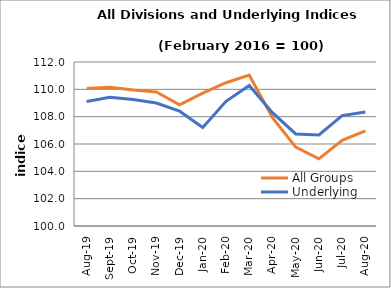
| Category | All Groups | Underlying |
|---|---|---|
| 2019-08-01 | 110.057 | 109.11 |
| 2019-09-01 | 110.148 | 109.423 |
| 2019-10-01 | 109.943 | 109.256 |
| 2019-11-01 | 109.811 | 108.998 |
| 2019-12-01 | 108.864 | 108.4 |
| 2020-01-01 | 109.718 | 107.211 |
| 2020-02-01 | 110.483 | 109.121 |
| 2020-03-01 | 111.043 | 110.276 |
| 2020-04-01 | 107.93 | 108.297 |
| 2020-05-01 | 105.77 | 106.735 |
| 2020-06-01 | 104.913 | 106.661 |
| 2020-07-01 | 106.265 | 108.077 |
| 2020-08-01 | 106.963 | 108.349 |